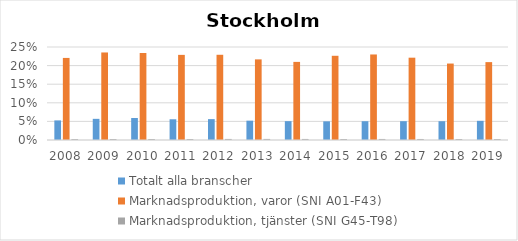
| Category | Totalt alla branscher | Marknadsproduktion, varor (SNI A01-F43) | Marknadsproduktion, tjänster (SNI G45-T98) |
|---|---|---|---|
| 2008 | 0.053 | 0.221 | 0.003 |
| 2009 | 0.057 | 0.235 | 0.003 |
| 2010 | 0.059 | 0.234 | 0.003 |
| 2011 | 0.056 | 0.229 | 0.003 |
| 2012 | 0.056 | 0.229 | 0.003 |
| 2013 | 0.052 | 0.217 | 0.003 |
| 2014 | 0.051 | 0.21 | 0.003 |
| 2015 | 0.05 | 0.226 | 0.003 |
| 2016 | 0.051 | 0.23 | 0.003 |
| 2017 | 0.051 | 0.221 | 0.003 |
| 2018 | 0.051 | 0.206 | 0.003 |
| 2019 | 0.052 | 0.209 | 0.003 |